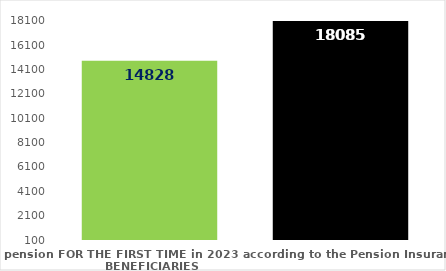
| Category | broj korisnika |
|---|---|
| Pension beneficiaries entitled to pension FOR THE FIRST TIME in 2023 according to the Pension Insurance Act  - NEW BENEFICIARIES | 14828 |
| Pension beneficiaries whose pension entitlement ceased in 2023  -  death caused,   
and who were retired according to the Pension Insurance Act   | 18085 |